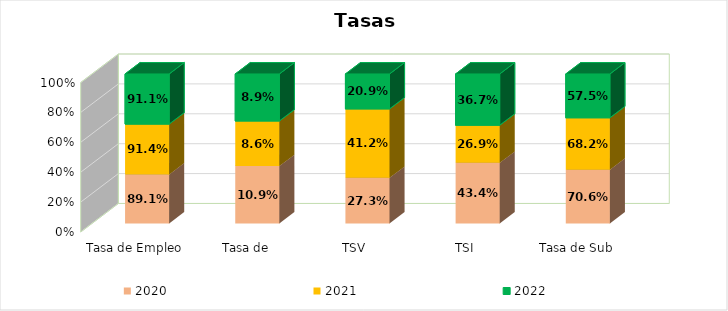
| Category | 2020 | 2021 | 2022 |
|---|---|---|---|
| Tasa de Empleo | 0.891 | 0.914 | 0.911 |
| Tasa de desempleo | 0.109 | 0.086 | 0.089 |
| TSV | 0.273 | 0.412 | 0.209 |
| TSI | 0.434 | 0.269 | 0.367 |
| Tasa de Sub Empleo  | 0.706 | 0.682 | 0.575 |